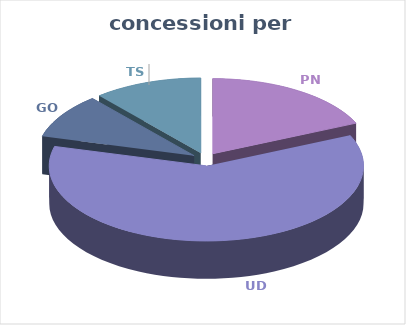
| Category | Series 0 |
|---|---|
| PN | 4682554 |
| UD | 15558080 |
| GO | 2464150 |
| TS | 2862870 |